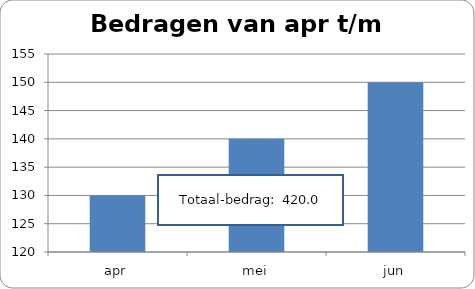
| Category | Bedrag |
|---|---|
| apr | 130 |
| mei | 140 |
| jun | 150 |